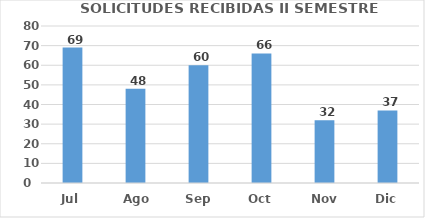
| Category | CANTIDAD |
|---|---|
| Jul | 69 |
| Ago | 48 |
| Sep | 60 |
| Oct | 66 |
| Nov | 32 |
| Dic | 37 |